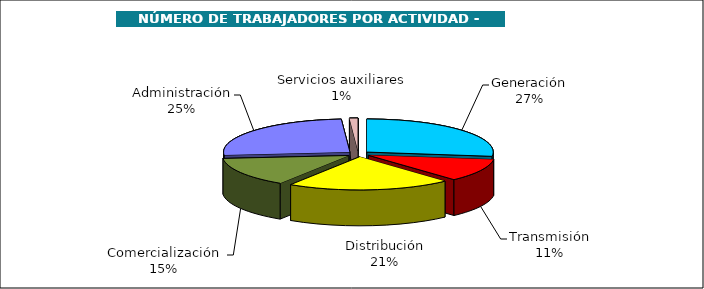
| Category | Series 0 |
|---|---|
| Generación | 27.056 |
| Transmisión | 11.098 |
| Distribución | 21.003 |
| Comercialización | 14.421 |
| Administración | 25.332 |
| Servicios auxiliares | 1.09 |